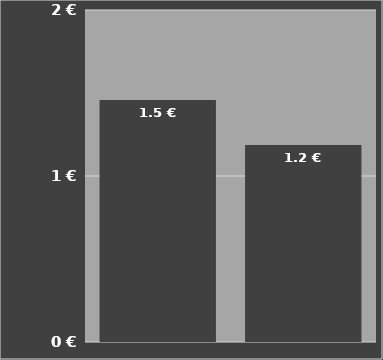
| Category | Kosten je m³
mit Trecker|LKW |
|---|---|
| Transportfass
für Güllefass | 1900-01-01 10:59:32 |
| Transportfass für Verschlauchung | 1900-01-01 04:28:25 |